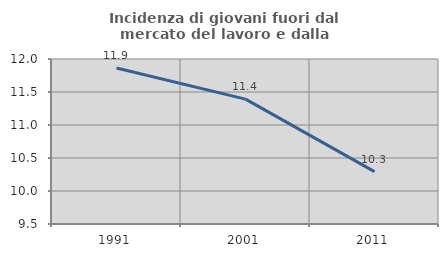
| Category | Incidenza di giovani fuori dal mercato del lavoro e dalla formazione  |
|---|---|
| 1991.0 | 11.864 |
| 2001.0 | 11.392 |
| 2011.0 | 10.294 |